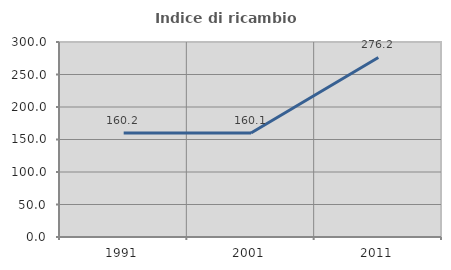
| Category | Indice di ricambio occupazionale  |
|---|---|
| 1991.0 | 160.173 |
| 2001.0 | 160.106 |
| 2011.0 | 276.216 |